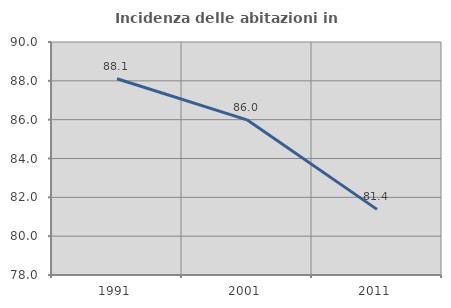
| Category | Incidenza delle abitazioni in proprietà  |
|---|---|
| 1991.0 | 88.105 |
| 2001.0 | 85.991 |
| 2011.0 | 81.38 |